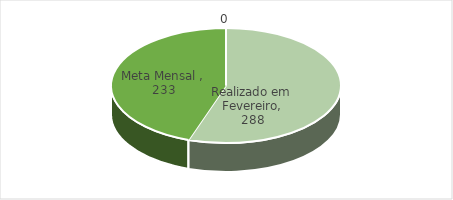
| Category | Series 0 |
|---|---|
| Realizado em Fevereiro | 288 |
| Meta Mensal  | 233 |